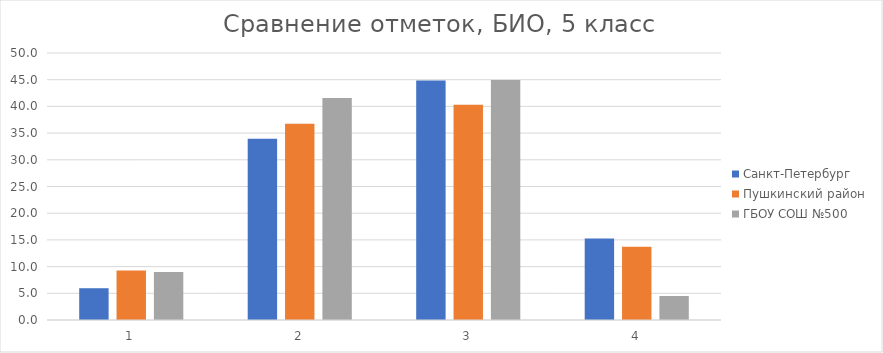
| Category | Санкт-Петербург | Пушкинский район | ГБОУ СОШ №500 |
|---|---|---|---|
| 0 | 5.95 | 9.26 | 8.99 |
| 1 | 33.94 | 36.73 | 41.57 |
| 2 | 44.85 | 40.31 | 44.94 |
| 3 | 15.26 | 13.7 | 4.49 |